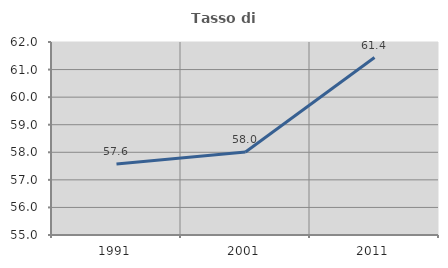
| Category | Tasso di occupazione   |
|---|---|
| 1991.0 | 57.579 |
| 2001.0 | 58.01 |
| 2011.0 | 61.436 |